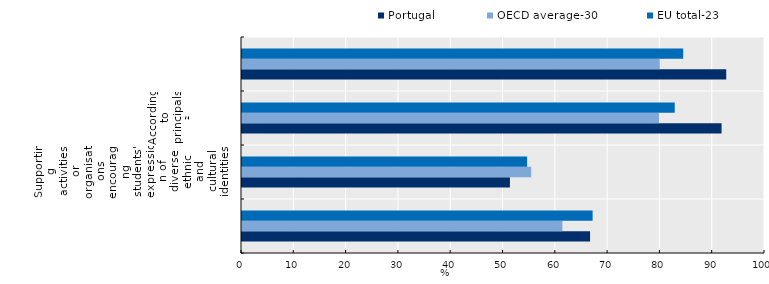
| Category | Portugal | OECD average-30 | EU total-23 |
|---|---|---|---|
| 0 | 66.555 | 61.261 | 67.038 |
| 1 | 51.228 | 55.294 | 54.512 |
| 2 | 91.693 | 79.757 | 82.741 |
| 3 | 92.585 | 79.875 | 84.36 |